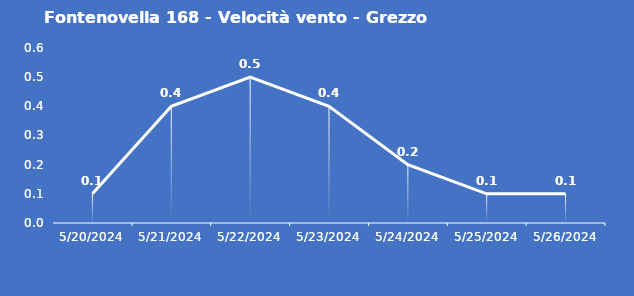
| Category | Fontenovella 168 - Velocità vento - Grezzo (m/s) |
|---|---|
| 5/20/24 | 0.1 |
| 5/21/24 | 0.4 |
| 5/22/24 | 0.5 |
| 5/23/24 | 0.4 |
| 5/24/24 | 0.2 |
| 5/25/24 | 0.1 |
| 5/26/24 | 0.1 |